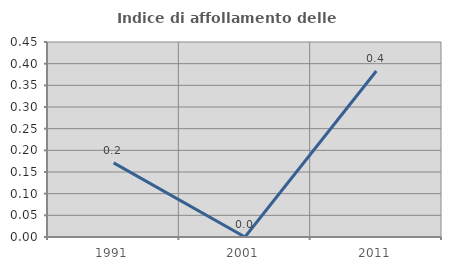
| Category | Indice di affollamento delle abitazioni  |
|---|---|
| 1991.0 | 0.171 |
| 2001.0 | 0 |
| 2011.0 | 0.383 |